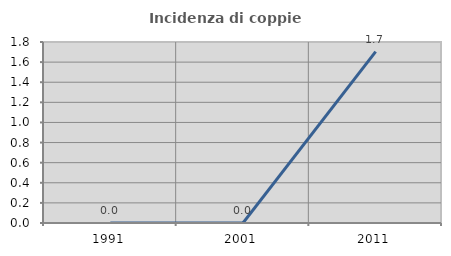
| Category | Incidenza di coppie miste |
|---|---|
| 1991.0 | 0 |
| 2001.0 | 0 |
| 2011.0 | 1.705 |